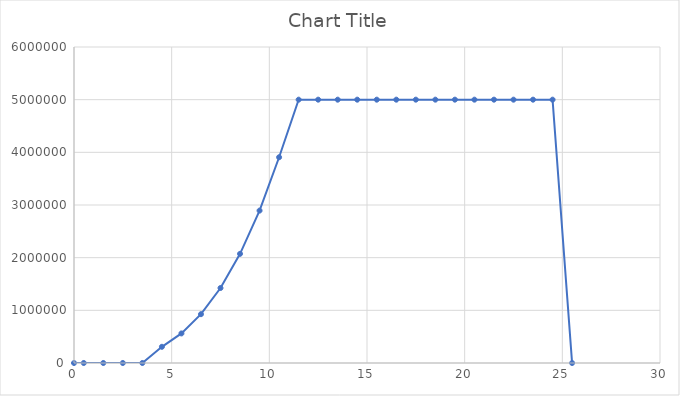
| Category | Series 0 |
|---|---|
| 0.0 | 0 |
| 0.5 | 0 |
| 1.5 | 0 |
| 2.5 | 0 |
| 3.5 | 0 |
| 4.5 | 307533.897 |
| 5.5 | 561491.93 |
| 6.5 | 926820.263 |
| 7.5 | 1423768.042 |
| 8.5 | 2072584.412 |
| 9.5 | 2893518.519 |
| 10.5 | 3906819.507 |
| 11.5 | 5000000 |
| 12.5 | 5000000 |
| 13.5 | 5000000 |
| 14.5 | 5000000 |
| 15.5 | 5000000 |
| 16.5 | 5000000 |
| 17.5 | 5000000 |
| 18.5 | 5000000 |
| 19.5 | 5000000 |
| 20.5 | 5000000 |
| 21.5 | 5000000 |
| 22.5 | 5000000 |
| 23.5 | 5000000 |
| 24.5 | 5000000 |
| 25.5 | 0 |